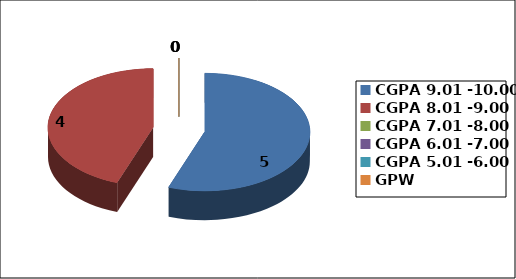
| Category | Series 0 |
|---|---|
| CGPA 9.01 -10.00 | 5 |
| CGPA 8.01 -9.00 | 4 |
| CGPA 7.01 -8.00 | 0 |
| CGPA 6.01 -7.00 | 0 |
| CGPA 5.01 -6.00 | 0 |
| GPW | 0 |